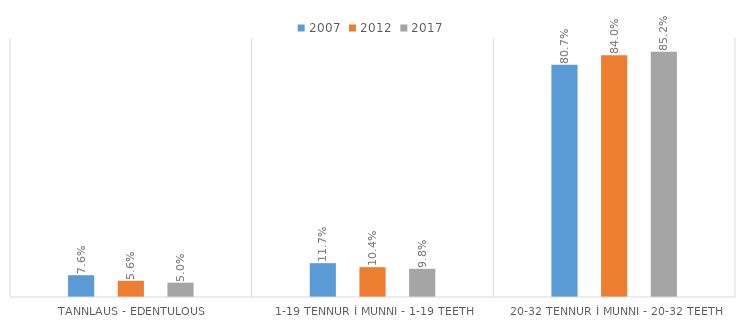
| Category | 2007 | 2012 | 2017 |
|---|---|---|---|
| Tannlaus - Edentulous | 0.076 | 0.056 | 0.05 |
| 1-19 tennur í munni - 1-19 teeth | 0.117 | 0.104 | 0.098 |
| 20-32 tennur í munni - 20-32 teeth | 0.807 | 0.84 | 0.852 |